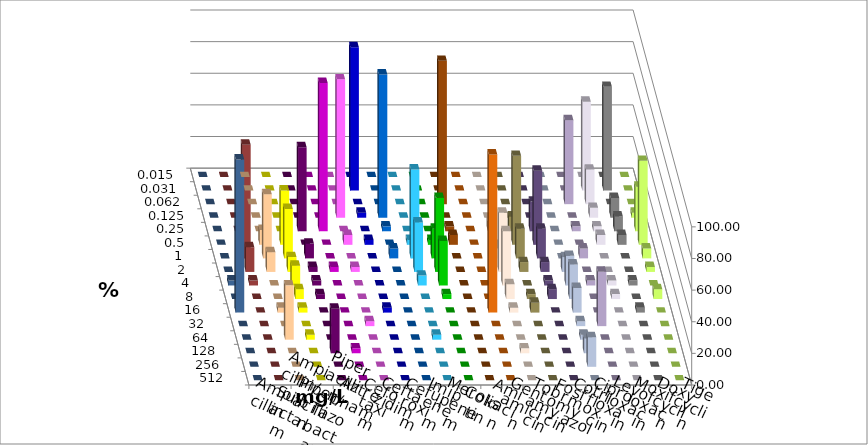
| Category | Ampicillin | Ampicillin/ Sulbactam | Piperacillin | Piperacillin/ Tazobactam | Aztreonam | Cefotaxim | Ceftazidim | Cefuroxim | Imipenem | Meropenem | Colistin | Amikacin | Gentamicin | Tobramycin | Fosfomycin | Cotrimoxazol | Ciprofloxacin | Levofloxacin | Moxifloxacin | Doxycyclin | Tigecyclin |
|---|---|---|---|---|---|---|---|---|---|---|---|---|---|---|---|---|---|---|---|---|---|
| 0.015 | 0 | 0 | 0 | 0 | 0 | 0 | 0 | 0 | 0 | 0 | 0 | 0 | 0 | 0 | 0 | 0 | 0 | 0 | 0 | 0 | 0 |
| 0.031 | 0 | 0 | 0 | 0 | 0 | 90.625 | 0 | 0 | 0 | 0 | 0 | 0 | 0 | 0 | 0 | 0 | 56.25 | 65.625 | 0 | 0 | 0 |
| 0.062 | 0 | 0 | 0 | 0 | 0 | 0 | 0 | 0 | 0 | 90.625 | 0 | 0 | 0 | 0 | 0 | 53.125 | 21.875 | 0 | 0 | 0 | 0 |
| 0.125 | 0 | 0 | 0 | 0 | 87.5 | 3.125 | 90.625 | 0 | 0 | 0 | 0 | 0 | 0 | 0 | 0 | 0 | 6.25 | 12.5 | 3.125 | 0 | 0 |
| 0.25 | 0 | 0 | 53.125 | 93.75 | 0 | 0 | 3.125 | 0 | 0 | 3.125 | 0 | 6.25 | 9.375 | 18.75 | 0 | 3.125 | 3.125 | 9.375 | 28.125 | 0 | 0 |
| 0.5 | 9.375 | 34.375 | 0 | 0 | 6.25 | 3.125 | 0 | 3.125 | 3.125 | 6.25 | 0 | 0 | 56.25 | 46.875 | 0 | 0 | 6.25 | 6.25 | 53.125 | 0 | 9.375 |
| 1.0 | 40.625 | 31.25 | 9.375 | 0 | 0 | 0 | 6.25 | 56.25 | 18.75 | 0 | 0 | 6.25 | 18.75 | 18.75 | 0 | 6.25 | 0 | 0 | 6.25 | 0 | 71.875 |
| 2.0 | 12.5 | 9.375 | 3.125 | 3.125 | 3.125 | 0 | 0 | 31.25 | 46.875 | 0 | 0 | 37.5 | 6.25 | 6.25 | 9.375 | 0 | 0 | 0 | 3.125 | 0 | 15.625 |
| 4.0 | 0 | 12.5 | 3.125 | 0 | 0 | 0 | 0 | 6.25 | 28.125 | 0 | 0 | 34.375 | 0 | 3.125 | 18.75 | 3.125 | 3.125 | 3.125 | 0 | 3.125 | 3.125 |
| 8.0 | 0 | 6.25 | 3.125 | 0 | 0 | 0 | 0 | 0 | 3.125 | 0 | 0 | 9.375 | 3.125 | 6.25 | 21.875 | 0 | 3.125 | 0 | 6.25 | 0 | 0 |
| 16.0 | 3.125 | 3.125 | 0 | 0 | 0 | 3.125 | 0 | 0 | 0 | 0 | 100 | 3.125 | 6.25 | 0 | 15.625 | 0 | 0 | 3.125 | 0 | 96.875 | 0 |
| 32.0 | 0 | 0 | 0 | 0 | 3.125 | 0 | 0 | 0 | 0 | 0 | 0 | 0 | 0 | 0 | 3.125 | 34.375 | 0 | 0 | 0 | 0 | 0 |
| 64.0 | 34.375 | 3.125 | 0 | 0 | 0 | 0 | 0 | 3.125 | 0 | 0 | 0 | 0 | 0 | 0 | 3.125 | 0 | 0 | 0 | 0 | 0 | 0 |
| 128.0 | 0 | 0 | 28.125 | 3.125 | 0 | 0 | 0 | 0 | 0 | 0 | 0 | 3.125 | 0 | 0 | 9.375 | 0 | 0 | 0 | 0 | 0 | 0 |
| 256.0 | 0 | 0 | 0 | 0 | 0 | 0 | 0 | 0 | 0 | 0 | 0 | 0 | 0 | 0 | 18.75 | 0 | 0 | 0 | 0 | 0 | 0 |
| 512.0 | 0 | 0 | 0 | 0 | 0 | 0 | 0 | 0 | 0 | 0 | 0 | 0 | 0 | 0 | 0 | 0 | 0 | 0 | 0 | 0 | 0 |